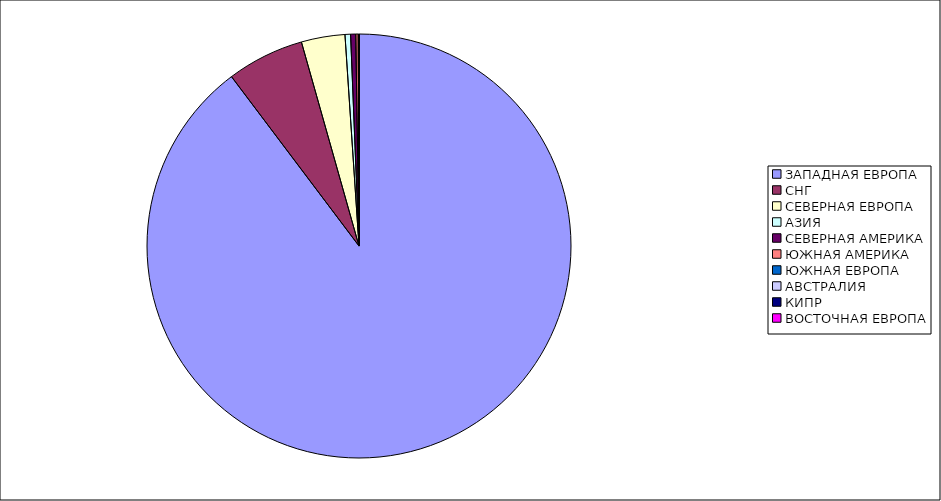
| Category | Оборот |
|---|---|
| ЗАПАДНАЯ ЕВРОПА | 0.897 |
| СНГ | 0.059 |
| СЕВЕРНАЯ ЕВРОПА | 0.033 |
| АЗИЯ | 0.004 |
| СЕВЕРНАЯ АМЕРИКА | 0.004 |
| ЮЖНАЯ АМЕРИКА | 0.002 |
| ЮЖНАЯ ЕВРОПА | 0 |
| АВСТРАЛИЯ | 0 |
| КИПР | 0 |
| ВОСТОЧНАЯ ЕВРОПА | 0 |